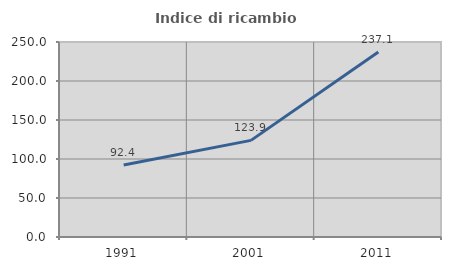
| Category | Indice di ricambio occupazionale  |
|---|---|
| 1991.0 | 92.393 |
| 2001.0 | 123.9 |
| 2011.0 | 237.146 |